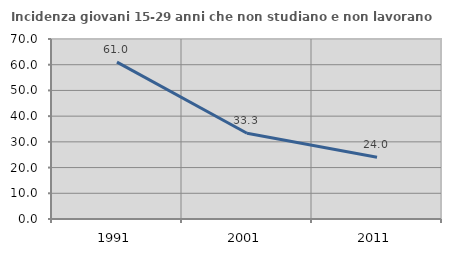
| Category | Incidenza giovani 15-29 anni che non studiano e non lavorano  |
|---|---|
| 1991.0 | 60.996 |
| 2001.0 | 33.333 |
| 2011.0 | 24.022 |